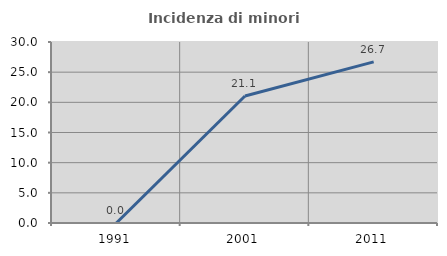
| Category | Incidenza di minori stranieri |
|---|---|
| 1991.0 | 0 |
| 2001.0 | 21.053 |
| 2011.0 | 26.699 |